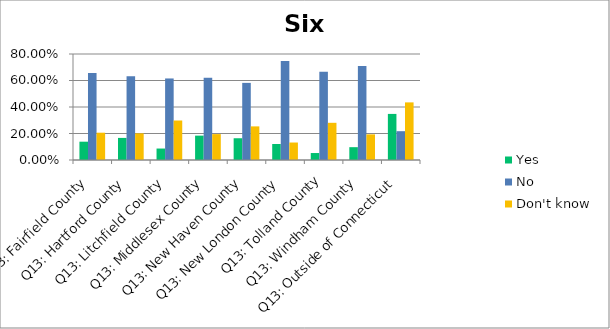
| Category | Yes | No | Don't know |
|---|---|---|---|
| Q13: Fairfield County | 0.138 | 0.656 | 0.206 |
| Q13: Hartford County | 0.167 | 0.632 | 0.201 |
| Q13: Litchfield County | 0.087 | 0.615 | 0.298 |
| Q13: Middlesex County | 0.184 | 0.621 | 0.195 |
| Q13: New Haven County | 0.164 | 0.582 | 0.254 |
| Q13: New London County | 0.121 | 0.747 | 0.132 |
| Q13: Tolland County | 0.053 | 0.667 | 0.281 |
| Q13: Windham County | 0.097 | 0.71 | 0.194 |
| Q13: Outside of Connecticut | 0.348 | 0.217 | 0.435 |